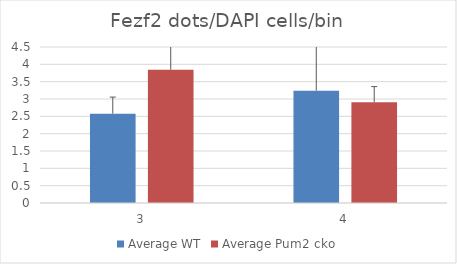
| Category | Average WT | Average Pum2 cko |
|---|---|---|
| 3.0 | 2.577 | 3.845 |
| 4.0 | 3.24 | 2.908 |